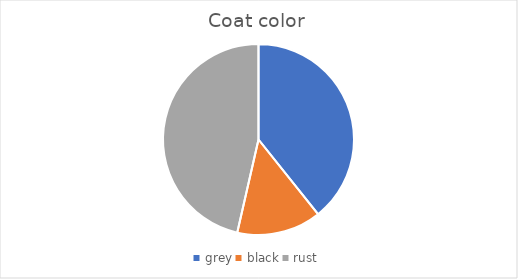
| Category | Series 0 |
|---|---|
| grey | 11 |
| black | 4 |
| rust | 13 |